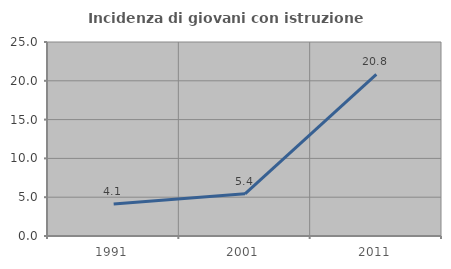
| Category | Incidenza di giovani con istruzione universitaria |
|---|---|
| 1991.0 | 4.124 |
| 2001.0 | 5.435 |
| 2011.0 | 20.833 |